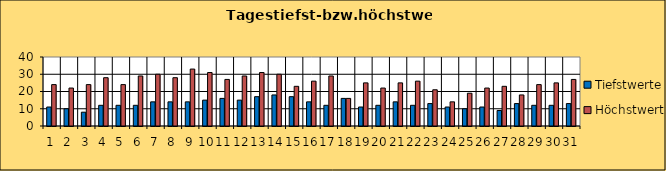
| Category | Tiefstwerte | Höchstwerte |
|---|---|---|
| 0 | 11 | 24 |
| 1 | 10 | 22 |
| 2 | 8 | 24 |
| 3 | 12 | 28 |
| 4 | 12 | 24 |
| 5 | 12 | 29 |
| 6 | 14 | 30 |
| 7 | 14 | 28 |
| 8 | 14 | 33 |
| 9 | 15 | 31 |
| 10 | 16 | 27 |
| 11 | 15 | 29 |
| 12 | 17 | 31 |
| 13 | 18 | 30 |
| 14 | 17 | 23 |
| 15 | 14 | 26 |
| 16 | 12 | 29 |
| 17 | 16 | 16 |
| 18 | 11 | 25 |
| 19 | 12 | 22 |
| 20 | 14 | 25 |
| 21 | 12 | 26 |
| 22 | 13 | 21 |
| 23 | 11 | 14 |
| 24 | 10 | 19 |
| 25 | 11 | 22 |
| 26 | 9 | 23 |
| 27 | 13 | 18 |
| 28 | 12 | 24 |
| 29 | 12 | 25 |
| 30 | 13 | 27 |